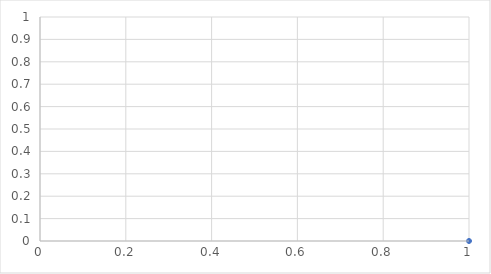
| Category | #REF! |
|---|---|
| 0 | 0 |
| 1 | 0 |
| 2 | 0 |
| 3 | 0 |
| 4 | 0 |
| 5 | 0 |
| 6 | 0 |
| 7 | 0 |
| 8 | 0 |
| 9 | 0 |
| 10 | 0 |
| 11 | 0 |
| 12 | 0 |